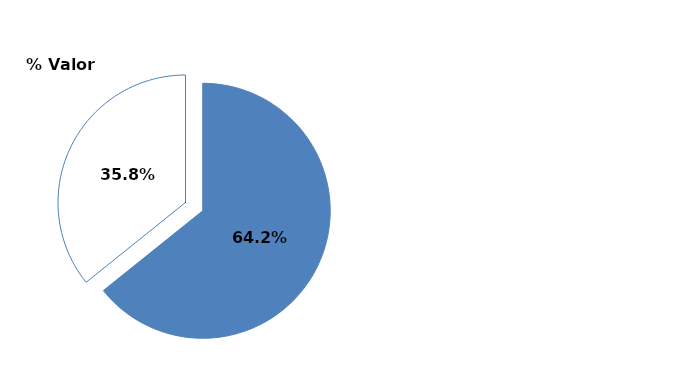
| Category | Series 0 |
|---|---|
| Fuera | 0.642 |
| Dentro | 0.358 |